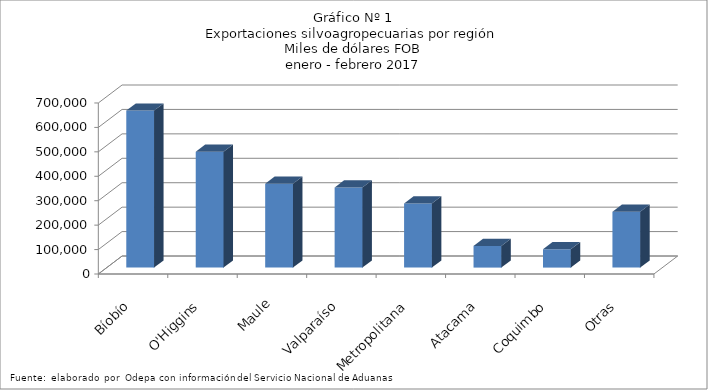
| Category | Series 0 |
|---|---|
| Bíobío | 642683.361 |
| O'Higgins | 474616.972 |
| Maule | 343047.413 |
| Valparaíso | 328105.076 |
| Metropolitana | 262318.665 |
| Atacama | 88831.097 |
| Coquimbo | 74985.071 |
| Otras | 228992.688 |